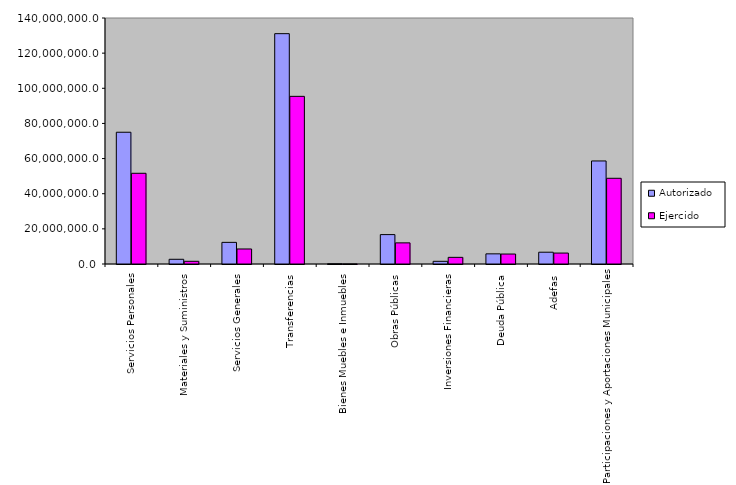
| Category | Autorizado | Ejercido |
|---|---|---|
| 0 | 74987851.6 | 51623192.9 |
| 1 | 2683737.4 | 1537812.3 |
| 2 | 12307259.3 | 8551554.7 |
| 3 | 131082558.5 | 95406961.6 |
| 4 | 141744 | 27322.1 |
| 5 | 16732518.4 | 12030766.8 |
| 6 | 1528644.5 | 3782576.8 |
| 7 | 5776982.7 | 5669005 |
| 8 | 6709482.3 | 6220128.5 |
| 9 | 58642613.9 | 48780014.8 |